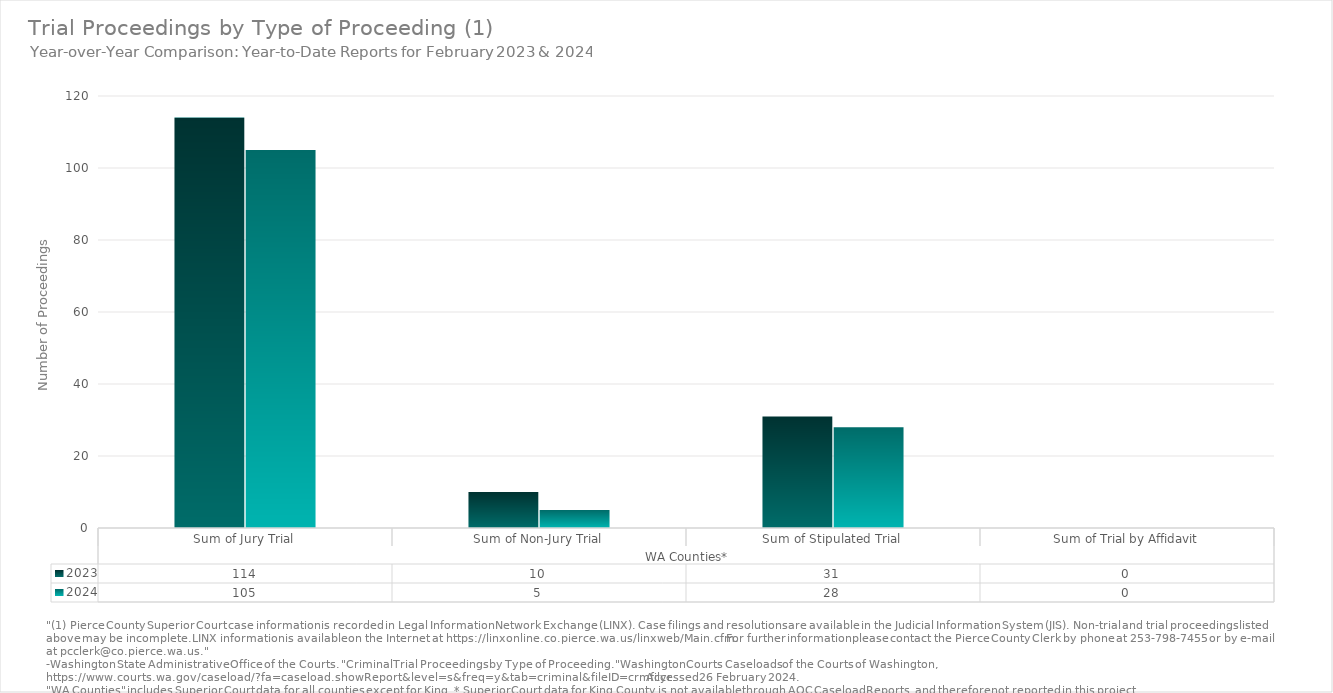
| Category | 2023 | 2024 |
|---|---|---|
| 0 | 114 | 105 |
| 1 | 10 | 5 |
| 2 | 31 | 28 |
| 3 | 0 | 0 |